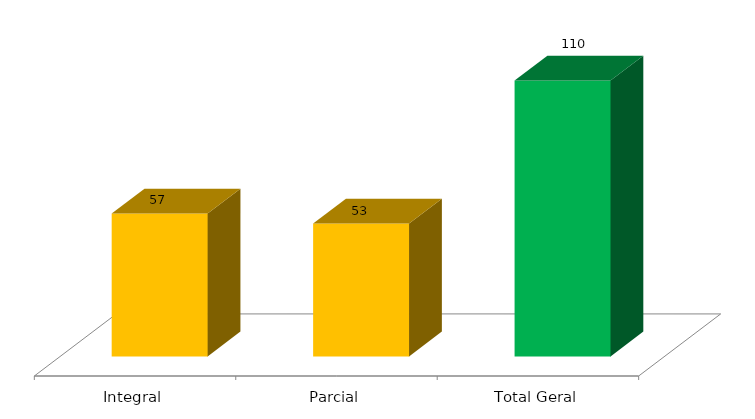
| Category | Categoria/Ano |
|---|---|
| Integral | 57 |
| Parcial | 53 |
| Total Geral | 110 |